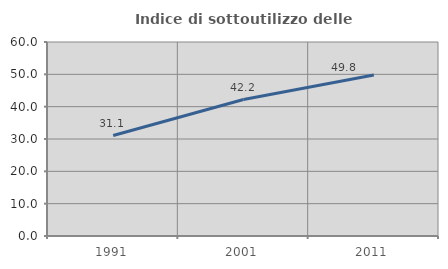
| Category | Indice di sottoutilizzo delle abitazioni  |
|---|---|
| 1991.0 | 31.075 |
| 2001.0 | 42.199 |
| 2011.0 | 49.81 |